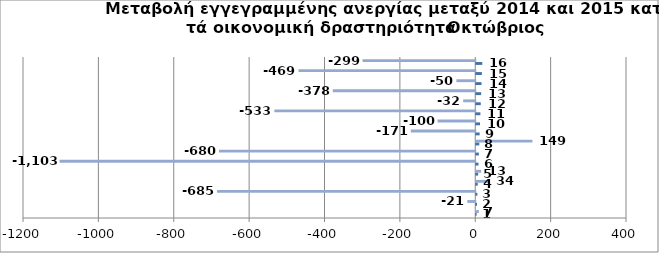
| Category | Series 0 | Series 1 |
|---|---|---|
| 0 | 1 | 7 |
| 1 | 2 | -21 |
| 2 | 3 | -685 |
| 3 | 4 | 34 |
| 4 | 5 | 13 |
| 5 | 6 | -1103 |
| 6 | 7 | -680 |
| 7 | 8 | 149 |
| 8 | 9 | -171 |
| 9 | 10 | -100 |
| 10 | 11 | -533 |
| 11 | 12 | -32 |
| 12 | 13 | -378 |
| 13 | 14 | -50 |
| 14 | 15 | -469 |
| 15 | 16 | -299 |